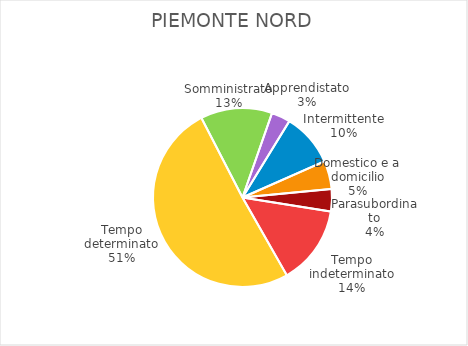
| Category | Piemonte Nord |
|---|---|
| Tempo indeterminato | 6329 |
| Tempo determinato | 22490 |
| Somministrato | 5742 |
| Apprendistato | 1514 |
| Intermittente | 4272 |
| Domestico e a domicilio | 2258 |
| Parasubordinato | 1790 |